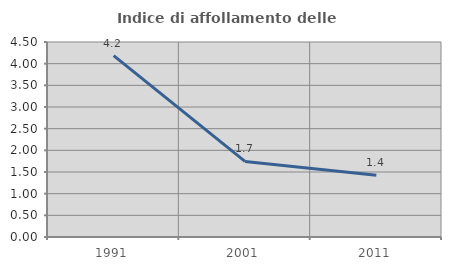
| Category | Indice di affollamento delle abitazioni  |
|---|---|
| 1991.0 | 4.184 |
| 2001.0 | 1.744 |
| 2011.0 | 1.424 |